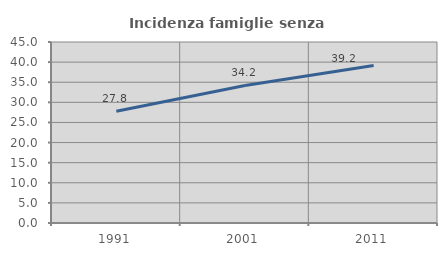
| Category | Incidenza famiglie senza nuclei |
|---|---|
| 1991.0 | 27.763 |
| 2001.0 | 34.192 |
| 2011.0 | 39.173 |